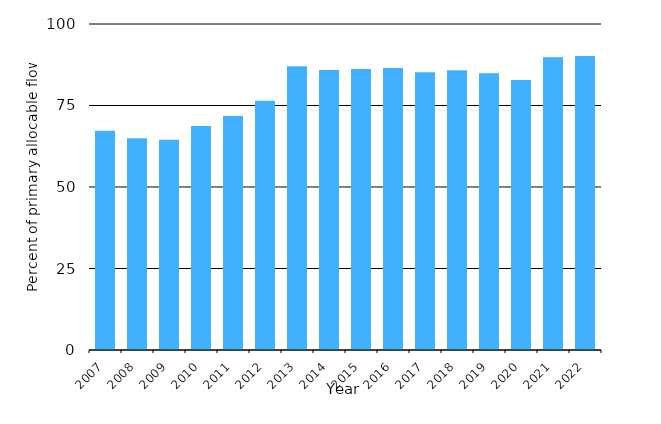
| Category | Allocated volume compared to primary allocable flow - Waikato River at mouth |
|---|---|
| 2007.0 | 67.223 |
| 2008.0 | 64.991 |
| 2009.0 | 64.461 |
| 2010.0 | 68.706 |
| 2011.0 | 71.778 |
| 2012.0 | 76.44 |
| 2013.0 | 87.071 |
| 2014.0 | 85.852 |
| 2015.0 | 86.2 |
| 2016.0 | 86.482 |
| 2017.0 | 85.2 |
| 2018.0 | 85.8 |
| 2019.0 | 84.855 |
| 2020.0 | 82.852 |
| 2021.0 | 89.824 |
| 2022.0 | 90.202 |